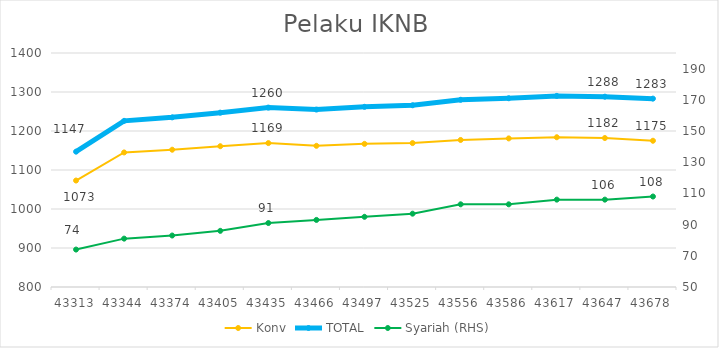
| Category | Konv | TOTAL |
|---|---|---|
| 43313.0 | 1073 | 1147 |
| 43344.0 | 1145 | 1226 |
| 43374.0 | 1152 | 1235 |
| 43405.0 | 1161 | 1247 |
| 43435.0 | 1169 | 1260 |
| 43466.0 | 1162 | 1255 |
| 43497.0 | 1167 | 1262 |
| 43525.0 | 1169 | 1266 |
| 43556.0 | 1177 | 1280 |
| 43586.0 | 1181 | 1284 |
| 43617.0 | 1184 | 1290 |
| 43647.0 | 1182 | 1288 |
| 43678.0 | 1175 | 1283 |